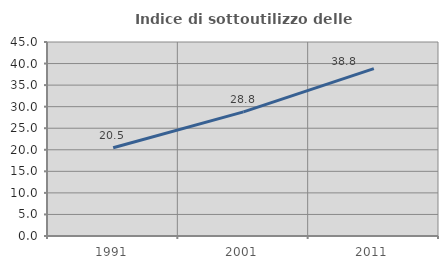
| Category | Indice di sottoutilizzo delle abitazioni  |
|---|---|
| 1991.0 | 20.459 |
| 2001.0 | 28.789 |
| 2011.0 | 38.824 |